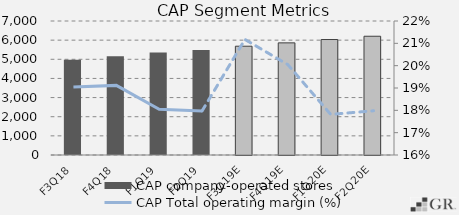
| Category | CAP company-operated stores |
|---|---|
|  F3Q18  | 4979 |
|  F4Q18  | 5159 |
|  F1Q19  | 5350 |
|  F2Q19  | 5483 |
|  F3Q19E  | 5683 |
|  F4Q19E  | 5858 |
|  F1Q20E  | 6032.75 |
|  F2Q20E  | 6203.438 |